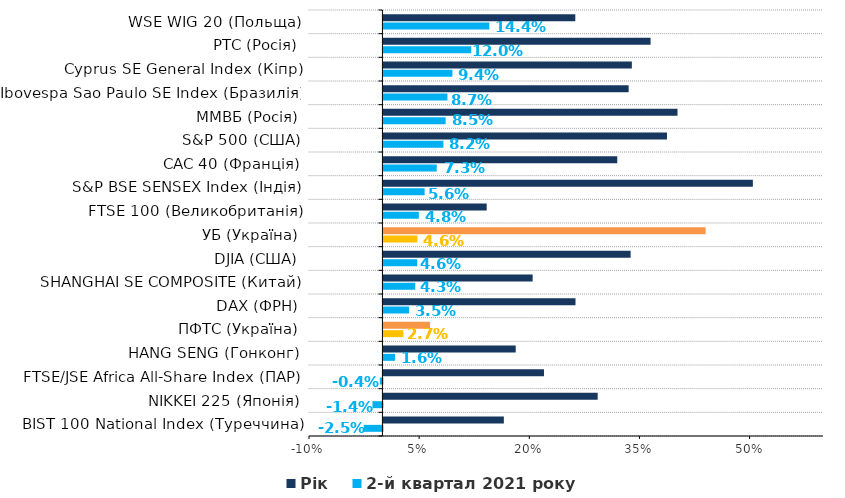
| Category | 2-й квартал 2021 року | Рік |
|---|---|---|
| BIST 100 National Index (Туреччина) | -0.025 | 0.164 |
| NIKKEI 225 (Японія) | -0.014 | 0.292 |
| FTSE/JSE Africa All-Share Index (ПАР) | -0.004 | 0.219 |
| HANG SENG (Гонконг) | 0.016 | 0.18 |
| ПФТС (Україна) | 0.027 | 0.063 |
| DAX (ФРН) | 0.035 | 0.262 |
| SHANGHAI SE COMPOSITE (Китай) | 0.043 | 0.203 |
| DJIA (США) | 0.046 | 0.337 |
| УБ (Україна) | 0.046 | 0.439 |
| FTSE 100 (Великобританія) | 0.048 | 0.141 |
| S&P BSE SENSEX Index (Індія) | 0.056 | 0.503 |
| CAC 40 (Франція) | 0.073 | 0.318 |
| S&P 500 (США) | 0.082 | 0.386 |
| ММВБ (Росія) | 0.085 | 0.4 |
| Ibovespa Sao Paulo SE Index (Бразилія) | 0.087 | 0.334 |
| Cyprus SE General Index (Кіпр) | 0.094 | 0.338 |
| РТС (Росія) | 0.12 | 0.364 |
| WSE WIG 20 (Польща) | 0.144 | 0.261 |